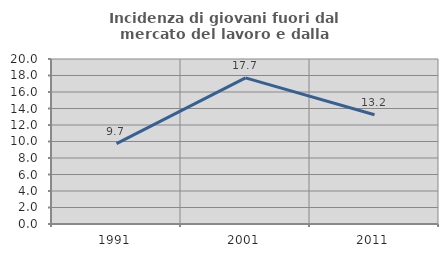
| Category | Incidenza di giovani fuori dal mercato del lavoro e dalla formazione  |
|---|---|
| 1991.0 | 9.741 |
| 2001.0 | 17.718 |
| 2011.0 | 13.243 |